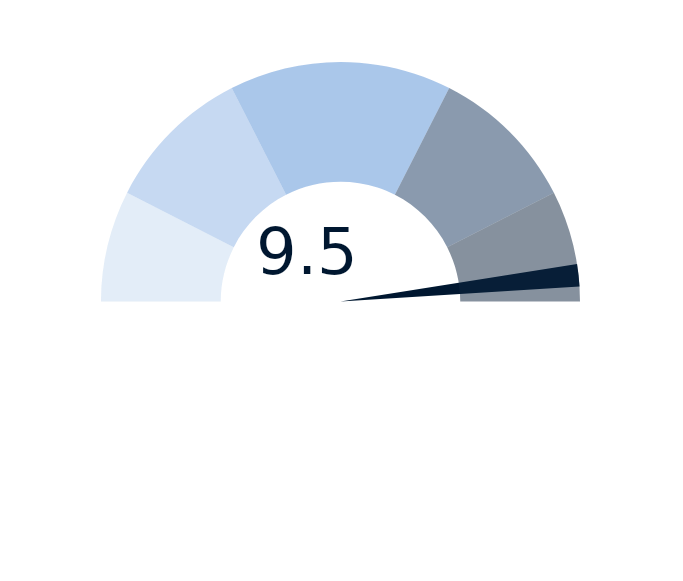
| Category | factor |
|---|---|
| 0 | 9.5 |
| 1 | 0.3 |
| 2 | 10.2 |